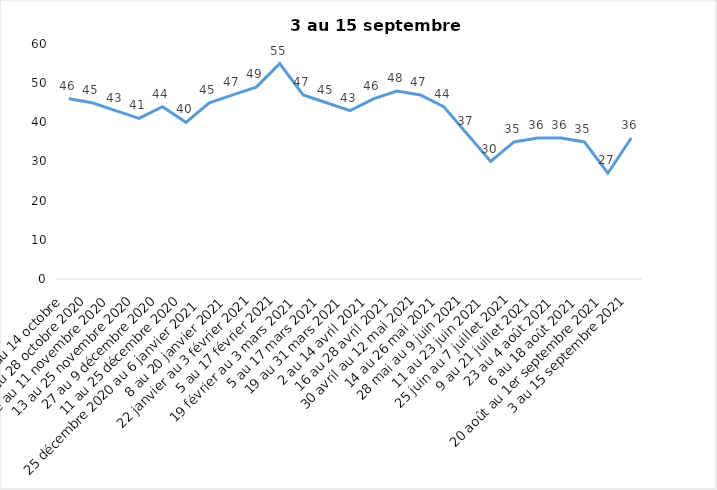
| Category | Toujours aux trois mesures |
|---|---|
| 2 au 14 octobre  | 46 |
| 16 au 28 octobre 2020 | 45 |
| 30 octobre au 11 novembre 2020 | 43 |
| 13 au 25 novembre 2020 | 41 |
| 27 au 9 décembre 2020 | 44 |
| 11 au 25 décembre 2020 | 40 |
| 25 décembre 2020 au 6 janvier 2021 | 45 |
| 8 au 20 janvier 2021 | 47 |
| 22 janvier au 3 février 2021 | 49 |
| 5 au 17 février 2021 | 55 |
| 19 février au 3 mars 2021 | 47 |
| 5 au 17 mars 2021 | 45 |
| 19 au 31 mars 2021 | 43 |
| 2 au 14 avril 2021 | 46 |
| 16 au 28 avril 2021 | 48 |
| 30 avril au 12 mai 2021 | 47 |
| 14 au 26 mai 2021 | 44 |
| 28 mai au 9 juin 2021 | 37 |
| 11 au 23 juin 2021 | 30 |
| 25 juin au 7 juillet 2021 | 35 |
| 9 au 21 juillet 2021 | 36 |
| 23 au 4 août 2021 | 36 |
| 6 au 18 août 2021 | 35 |
| 20 août au 1er septembre 2021 | 27 |
| 3 au 15 septembre 2021 | 36 |